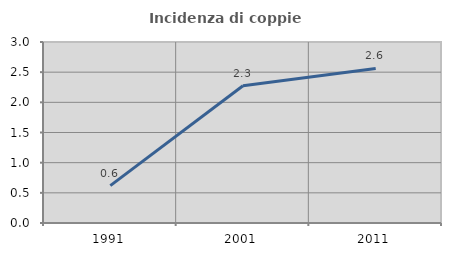
| Category | Incidenza di coppie miste |
|---|---|
| 1991.0 | 0.62 |
| 2001.0 | 2.275 |
| 2011.0 | 2.561 |